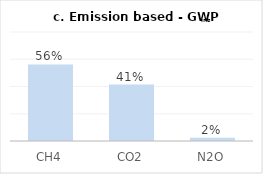
| Category | Series 0 |
|---|---|
| CH4 | 0.562 |
| CO2 | 0.414 |
| N2O | 0.024 |